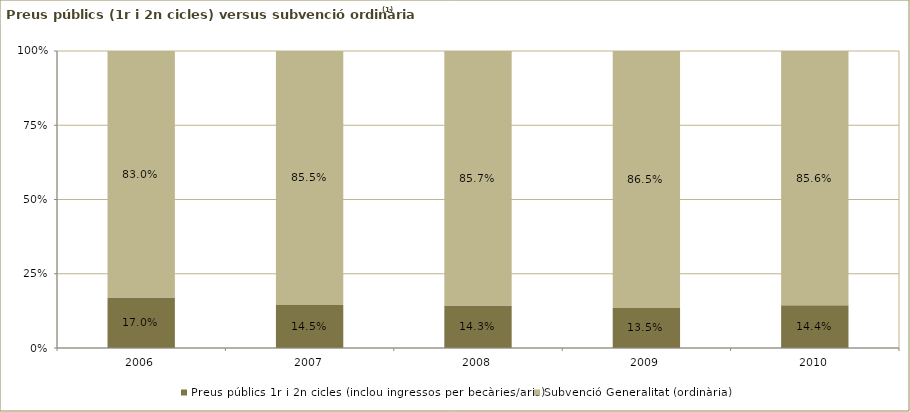
| Category | Preus públics 1r i 2n cicles (inclou ingressos per becàries/aris) | Subvenció Generalitat (ordinària) |
|---|---|---|
| 2006.0 | 0.17 | 0.83 |
| 2007.0 | 0.145 | 0.855 |
| 2008.0 | 0.143 | 0.857 |
| 2009.0 | 0.135 | 0.865 |
| 2010.0 | 0.144 | 0.856 |